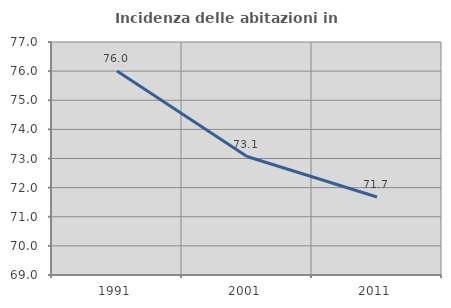
| Category | Incidenza delle abitazioni in proprietà  |
|---|---|
| 1991.0 | 76.005 |
| 2001.0 | 73.067 |
| 2011.0 | 71.676 |